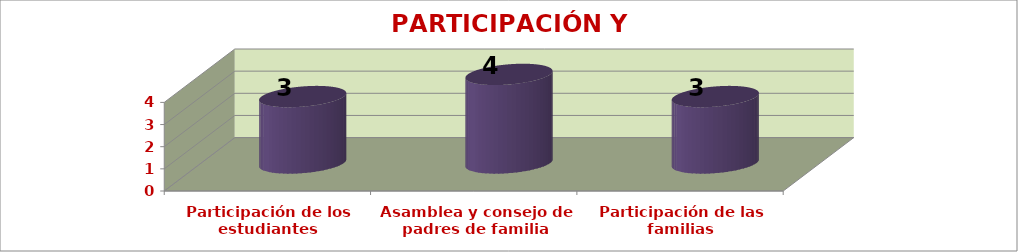
| Category | PARTICIPACIÓN Y CONVIVENCIA |
|---|---|
| Participación de los
estudiantes | 3 |
| Asamblea y consejo de padres de familia | 4 |
| Participación de las familias | 3 |